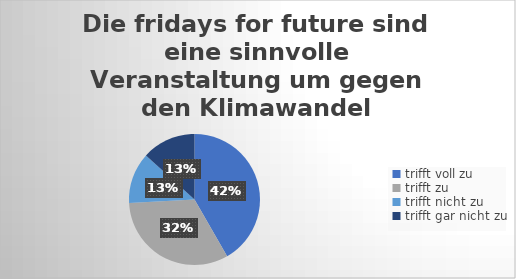
| Category | Die fridays for future sind eine sinnvolle Veranstaltung um gegen den Klimawandel vorzugehen. |
|---|---|
| trifft voll zu | 113 |
| trifft zu  | 88 |
| trifft nicht zu  | 34 |
| trifft gar nicht zu | 36 |